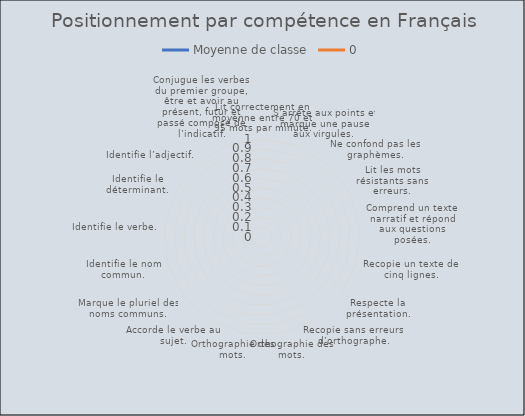
| Category | Moyenne de classe | 0 |
|---|---|---|
| Lit correctement en moyenne entre 70 et 95 mots par minute. | 0 |  |
| S’arrête aux points et marque une pause aux virgules. | 0 |  |
| Ne confond pas les graphèmes. | 0 |  |
| Lit les mots résistants sans erreurs. | 0 |  |
| Comprend un texte narratif et répond aux questions posées. | 0 |  |
| Recopie un texte de cinq lignes. | 0 |  |
| Respecte la présentation. | 0 |  |
| Recopie sans erreurs d’orthographe. | 0 |  |
| Orthographie des mots. | 0 |  |
| Orthographie des mots. | 0 |  |
| Accorde le verbe au sujet. | 0 |  |
| Marque le pluriel des noms communs. | 0 |  |
| Identifie le nom commun. | 0 |  |
| Identifie le verbe. | 0 |  |
| Identifie le déterminant. | 0 |  |
| Identifie l’adjectif. | 0 |  |
| Conjugue les verbes du premier groupe, être et avoir au présent, futur et passé composé de l’indicatif. | 0 |  |